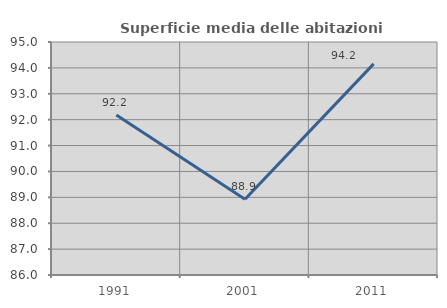
| Category | Superficie media delle abitazioni occupate |
|---|---|
| 1991.0 | 92.183 |
| 2001.0 | 88.927 |
| 2011.0 | 94.155 |